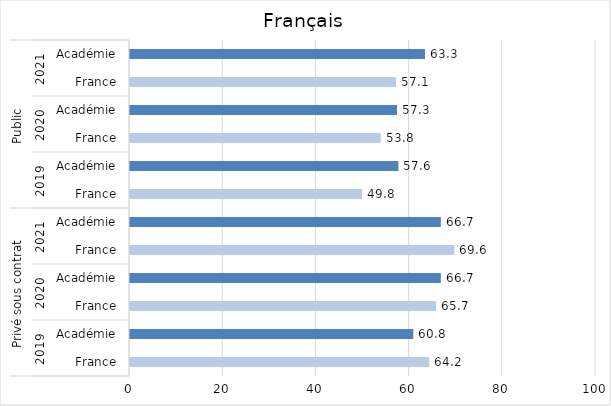
| Category | Français |
|---|---|
| 0 | 64.2 |
| 1 | 60.8 |
| 2 | 65.7 |
| 3 | 66.7 |
| 4 | 69.6 |
| 5 | 66.7 |
| 6 | 49.8 |
| 7 | 57.6 |
| 8 | 53.8 |
| 9 | 57.3 |
| 10 | 57.1 |
| 11 | 63.3 |